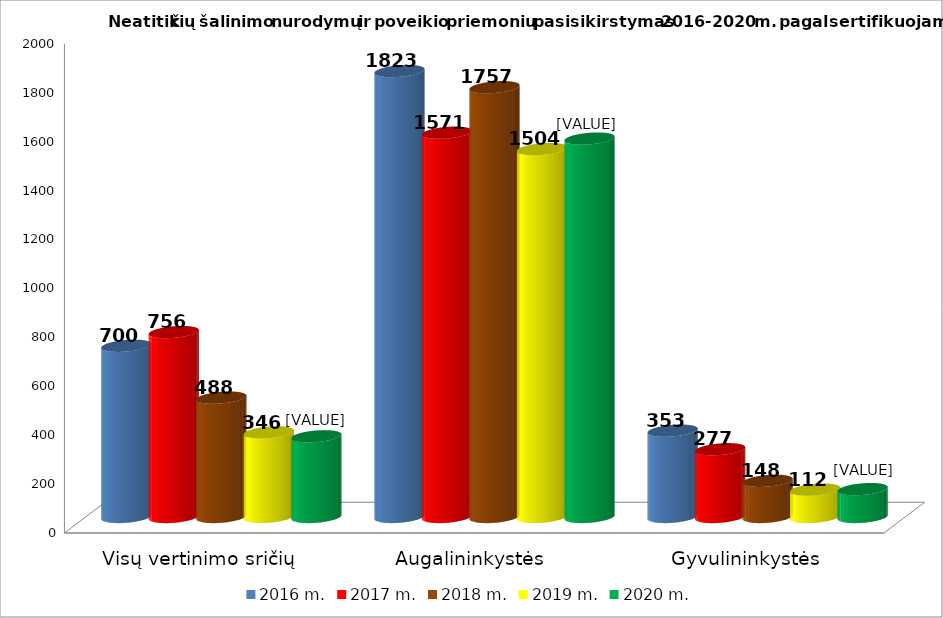
| Category | 2016 m. | 2017 m. | 2018 m. | 2019 m. | 2020 m. |
|---|---|---|---|---|---|
| Visų vertinimo sričių | 700 | 756 | 488 | 346 | 330 |
| Augalininkystės  | 1823 | 1571 | 1757 | 1504 | 1547 |
| Gyvulininkystės | 353 | 277 | 148 | 112 | 114 |